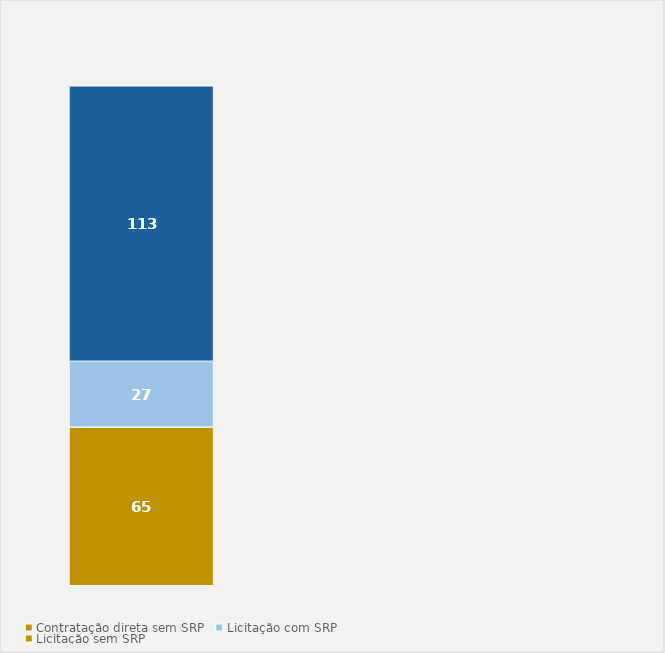
| Category | Contratação direta sem SRP | Licitação com SRP | Licitação sem SRP |
|---|---|---|---|
| Total | 65 | 27 | 113 |